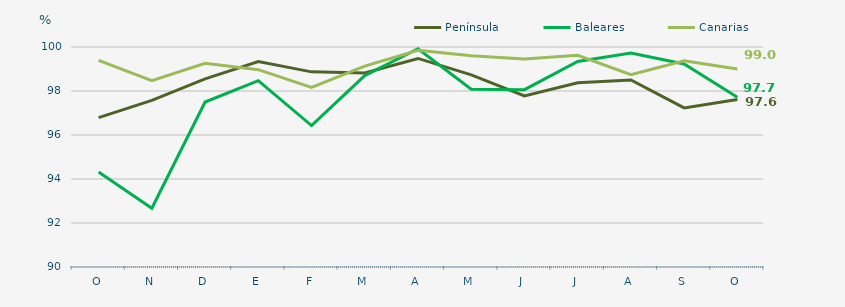
| Category | Península | Baleares | Canarias |
|---|---|---|---|
| O | 96.79 | 94.32 | 99.39 |
| N | 97.57 | 92.67 | 98.47 |
| D | 98.55 | 97.5 | 99.26 |
| E | 99.34 | 98.47 | 98.97 |
| F | 98.87 | 96.43 | 98.16 |
| M | 98.82 | 98.7 | 99.13 |
| A | 99.48 | 99.92 | 99.85 |
| M | 98.73 | 98.08 | 99.6 |
| J | 97.78 | 98.06 | 99.45 |
| J | 98.37 | 99.34 | 99.62 |
| A | 98.5 | 99.73 | 98.74 |
| S | 97.23 | 99.23 | 99.37 |
| O | 97.61 | 97.72 | 99 |